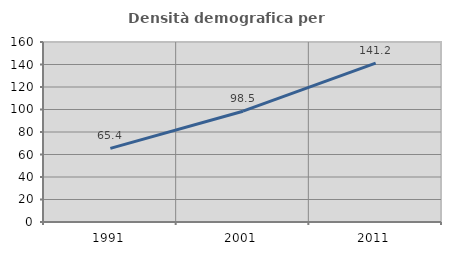
| Category | Densità demografica |
|---|---|
| 1991.0 | 65.399 |
| 2001.0 | 98.497 |
| 2011.0 | 141.165 |